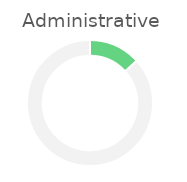
| Category | Administrative |
|---|---|
| 0 | 0.133 |
| 1 | 0.867 |